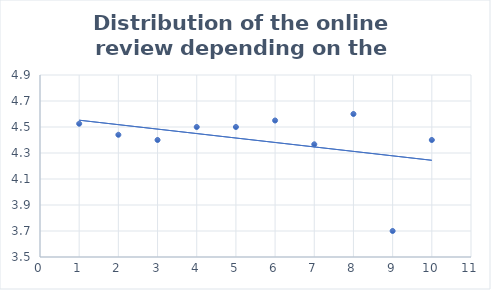
| Category | Series 0 |
|---|---|
| 0 | 4.525 |
| 1 | 4.44 |
| 2 | 4.4 |
| 3 | 4.5 |
| 4 | 4.5 |
| 5 | 4.55 |
| 6 | 4.367 |
| 7 | 4.6 |
| 8 | 3.7 |
| 9 | 4.4 |